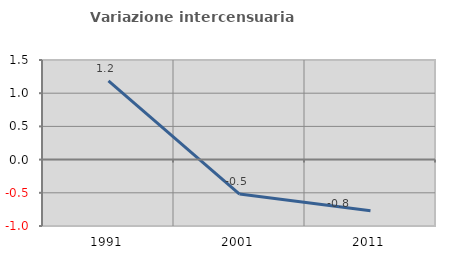
| Category | Variazione intercensuaria annua |
|---|---|
| 1991.0 | 1.185 |
| 2001.0 | -0.519 |
| 2011.0 | -0.77 |